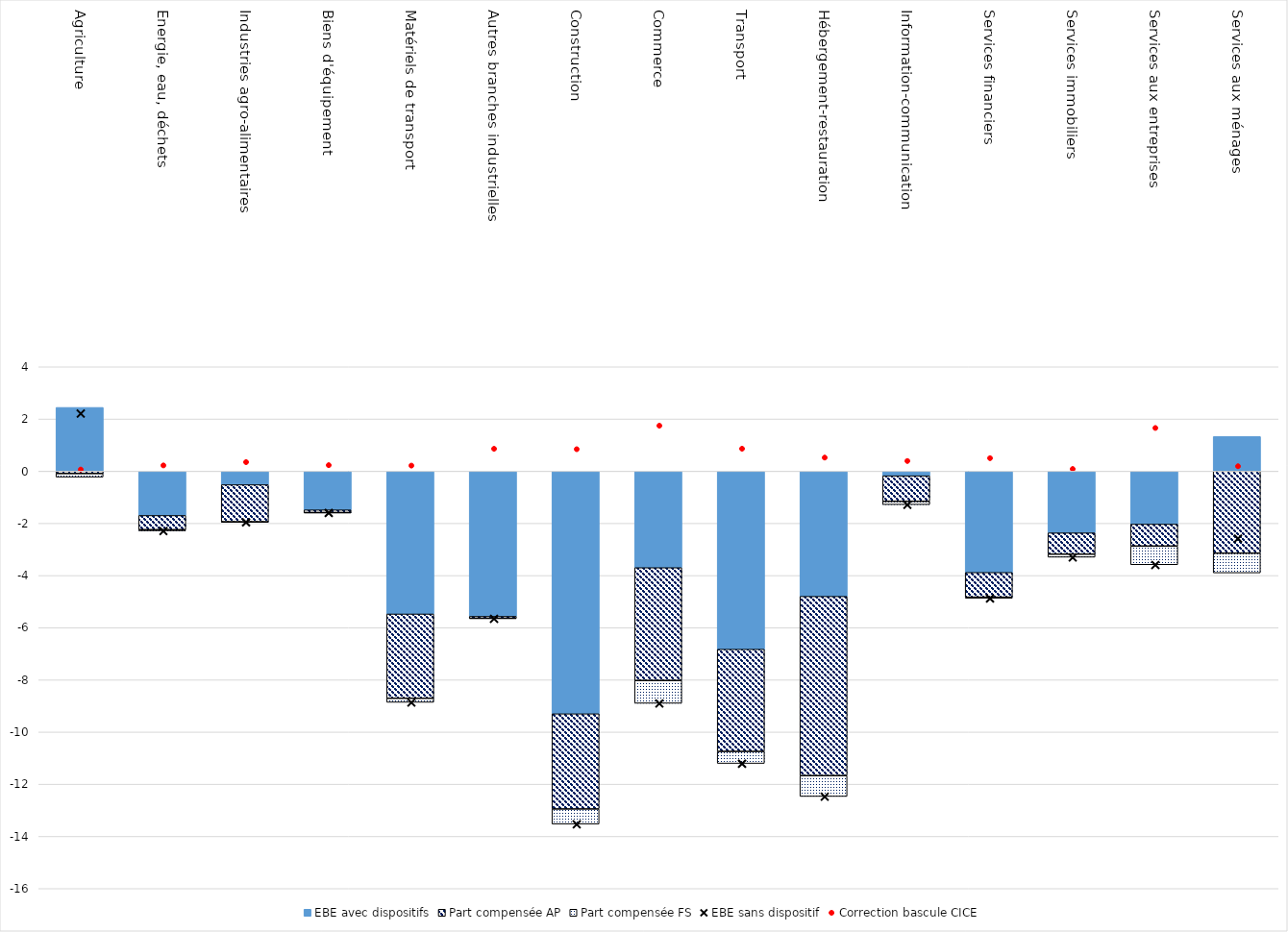
| Category | EBE avec dispositifs | Part compensée AP | Part compensée FS |
|---|---|---|---|
| Agriculture | 2.444 | -0.092 | -0.138 |
| Energie, eau, déchets | -1.698 | -0.546 | -0.044 |
| Industries agro-alimentaires | -0.519 | -1.428 | -0.005 |
| Biens d'équipement | -1.484 | -0.107 | -0.002 |
| Matériels de transport | -5.474 | -3.232 | -0.157 |
| Autres branches industrielles | -5.566 | -0.075 | -0.011 |
| Construction | -9.3 | -3.65 | -0.58 |
| Commerce | -3.698 | -4.325 | -0.876 |
| Transport | -6.827 | -3.917 | -0.462 |
| Hébergement-restauration | -4.799 | -6.873 | -0.8 |
| Information-communication | -0.176 | -0.98 | -0.127 |
| Services financiers | -3.883 | -0.948 | -0.042 |
| Services immobiliers | -2.366 | -0.816 | -0.118 |
| Services aux entreprises | -2.031 | -0.84 | -0.717 |
| Services aux ménages | 1.327 | -3.142 | -0.76 |